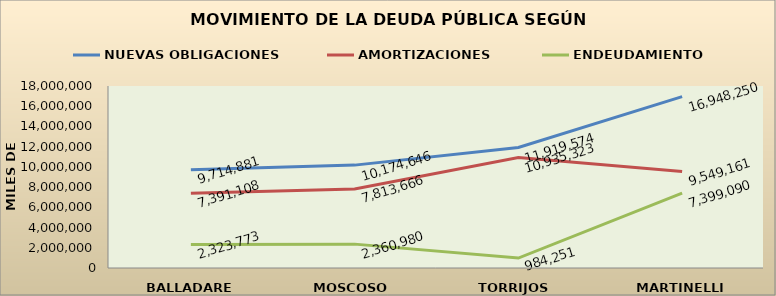
| Category | NUEVAS OBLIGACIONES | AMORTIZACIONES | ENDEUDAMIENTO |
|---|---|---|---|
| BALLADARES | 9714881 | 7391108 | 2323773 |
| MOSCOSO | 10174646 | 7813666 | 2360980 |
| TORRIJOS | 11919574 | 10935323 | 984251 |
| MARTINELLI | 16948250.309 | 9549160.637 | 7399089.672 |